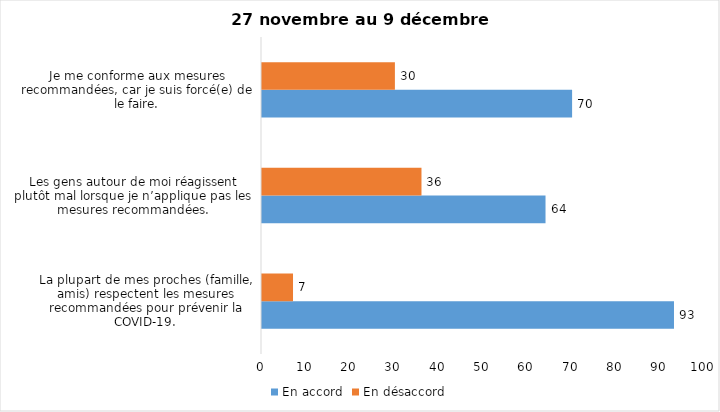
| Category | En accord | En désaccord |
|---|---|---|
| La plupart de mes proches (famille, amis) respectent les mesures recommandées pour prévenir la COVID-19. | 93 | 7 |
| Les gens autour de moi réagissent plutôt mal lorsque je n’applique pas les mesures recommandées. | 64 | 36 |
| Je me conforme aux mesures recommandées, car je suis forcé(e) de le faire. | 70 | 30 |